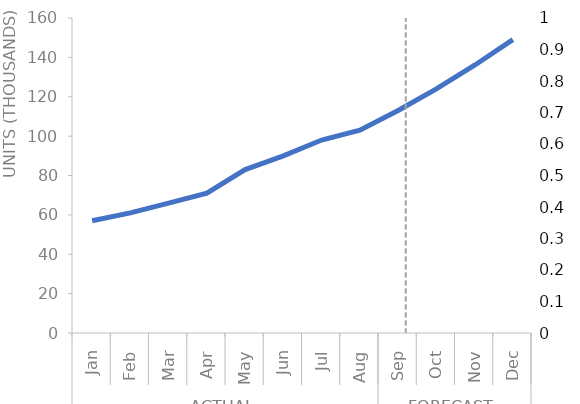
| Category | Units (k) |
|---|---|
| 0 | 57 |
| 1 | 61 |
| 2 | 66 |
| 3 | 71 |
| 4 | 83 |
| 5 | 90 |
| 6 | 98 |
| 7 | 103 |
| 8 | 113 |
| 9 | 124 |
| 10 | 136 |
| 11 | 149 |